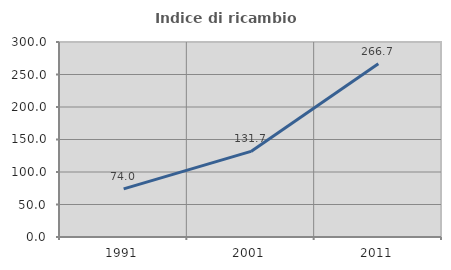
| Category | Indice di ricambio occupazionale  |
|---|---|
| 1991.0 | 73.973 |
| 2001.0 | 131.707 |
| 2011.0 | 266.667 |